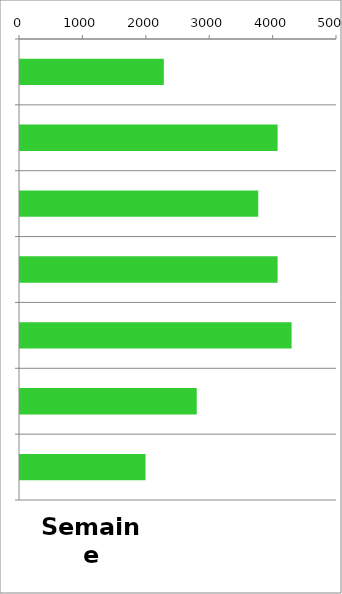
| Category | TV |
|---|---|
| 0 | 2268 |
| 1 | 4063 |
| 2 | 3758 |
| 3 | 4063 |
| 4 | 4284 |
| 5 | 2788 |
| 6 | 1980 |